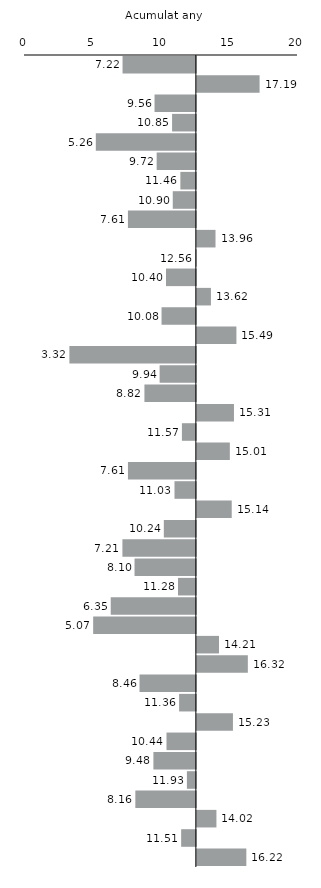
| Category | Series 0 |
|---|---|
| Alt Camp | 7.22 |
| Alt Empordà | 17.185 |
| Alt Penedès | 9.563 |
| Alt Urgell | 10.848 |
| Alta Ribagorça | 5.26 |
| Anoia | 9.719 |
| Bages | 11.456 |
| Baix Camp | 10.898 |
| Baix Ebre | 7.614 |
| Baix Empordà | 13.957 |
| Baix Llobregat | 12.556 |
| Baix Penedès | 10.403 |
| Barcelonès | 13.621 |
| Berguedà | 10.077 |
| Cerdanya | 15.487 |
| Conca de Barberà | 3.325 |
| Garraf | 9.936 |
| Garrigues | 8.822 |
| Garrotxa | 15.309 |
| Gironès | 11.567 |
| Maresme | 15.006 |
| Montsià | 7.614 |
| Noguera | 11.025 |
| Osona | 15.144 |
| Pallars Jussà | 10.243 |
| Pallars Sobirà | 7.209 |
| Pla d'Urgell | 8.097 |
| Pla de l'Estany | 11.281 |
| Priorat | 6.354 |
| Ribera d'Ebre | 5.067 |
| Ripollès | 14.212 |
| Segarra | 16.324 |
| Segrià | 8.463 |
| Selva | 11.364 |
| Solsonès | 15.234 |
| Tarragonès | 10.439 |
| Terra Alta | 9.479 |
| Urgell | 11.933 |
| Aran | 8.157 |
| Vallès Occidental | 14.025 |
| Vallès Oriental | 11.513 |
| Moianès | 16.215 |